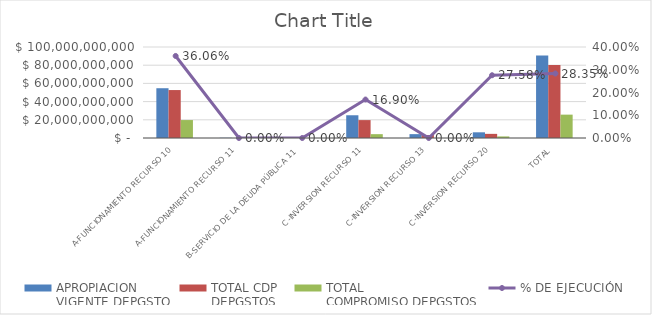
| Category | APROPIACION
VIGENTE DEPGSTO | TOTAL CDP
DEPGSTOS | TOTAL
COMPROMISO DEPGSTOS |
|---|---|---|---|
| A-FUNCIONAMIENTO RECURSO 10 | 54696000000 | 52687283928.1 | 19723831551.42 |
| A-FUNCIONAMIENTO RECURSO 11 | 231000000 | 0 | 0 |
| B-SERVICIO DE LA DEUDA PÚBLICA 11 | 131748779 | 0 | 0 |
| C-INVERSION RECURSO 11 | 24983074635 | 19670740401.65 | 4222448097.35 |
| C-INVERSION RECURSO 13 | 4242000000 | 3242000000 | 0 |
| C-INVERSION RECURSO 20 | 6251000000 | 4543723025 | 1724268413 |
| TOTAL | 90559823414 | 80143747354.75 | 25670548061.77 |